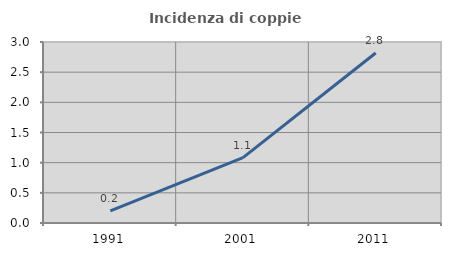
| Category | Incidenza di coppie miste |
|---|---|
| 1991.0 | 0.199 |
| 2001.0 | 1.083 |
| 2011.0 | 2.818 |